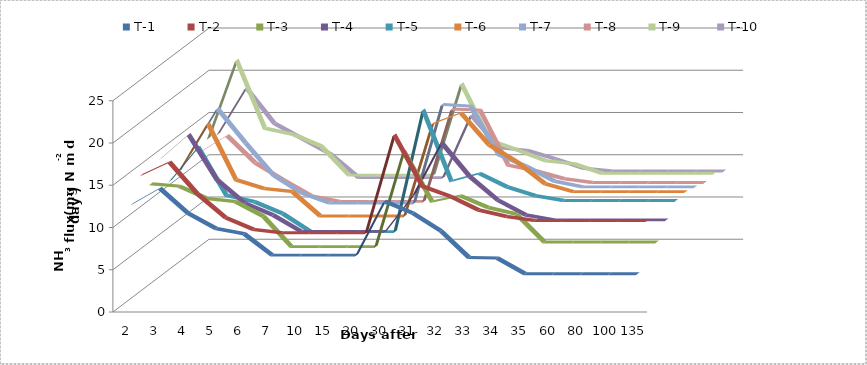
| Category | T-1 | T-2  | T-3 | T-4 | T-5  | T-6 | T-7 | T-8 | T-9  | T-10  |
|---|---|---|---|---|---|---|---|---|---|---|
| 2.0 | 12.25 | 14.84 | 12.95 | 15.05 | 11.55 | 11.9 | 12.915 | 12.32 | 13.16 | 12.81 |
| 3.0 | 14.14 | 16.38 | 12.67 | 17.92 | 15.54 | 17.5 | 18.41 | 14.35 | 22.4 | 18.27 |
| 4.0 | 11.2 | 12.6 | 11.2 | 12.6 | 9.87 | 10.85 | 14.35 | 11.13 | 14.35 | 14.07 |
| 5.0 | 9.38 | 9.8 | 10.85 | 9.8 | 9.1 | 9.8 | 10.5 | 9.1 | 13.65 | 12.25 |
| 6.0 | 8.75 | 8.4 | 9.1 | 8.4 | 7.7 | 9.45 | 8.4 | 7.21 | 12.25 | 10.43 |
| 7.0 | 6.23 | 8.01 | 5.51 | 6.458 | 5.56 | 6.56 | 7.22 | 6.56 | 8.81 | 7.65 |
| 10.0 | 6.23 | 8.01 | 5.51 | 6.458 | 5.56 | 6.56 | 7.22 | 6.56 | 8.81 | 7.65 |
| 15.0 | 6.23 | 8.01 | 5.51 | 6.458 | 5.56 | 6.56 | 7.22 | 6.56 | 8.81 | 7.65 |
| 20.0 | 6.23 | 8.01 | 5.51 | 6.458 | 5.56 | 6.56 | 7.22 | 6.56 | 8.81 | 7.65 |
| 30.0 | 12.6 | 19.6 | 16.8 | 10.71 | 19.95 | 17.5 | 18.9 | 17.5 | 19.6 | 15.05 |
| 31.0 | 11.2 | 13.51 | 10.85 | 16.94 | 11.55 | 18.76 | 18.69 | 17.36 | 12.95 | 11.2 |
| 32.0 | 9.1 | 12.32 | 11.55 | 12.95 | 12.46 | 14.98 | 12.95 | 10.85 | 11.76 | 10.85 |
| 33.0 | 5.95 | 10.71 | 10.15 | 10.15 | 10.85 | 12.95 | 11.55 | 10.15 | 10.5 | 9.87 |
| 34.0 | 5.88 | 9.94 | 9.38 | 8.4 | 9.8 | 10.36 | 9.8 | 9.24 | 10.15 | 8.75 |
| 35.0 | 4.03 | 9.46 | 6.05 | 7.81 | 9.24 | 9.44 | 9.14 | 8.8 | 9.024 | 8.44 |
| 60.0 | 4.03 | 9.46 | 6.05 | 7.81 | 9.24 | 9.44 | 9.14 | 8.8 | 9.024 | 8.44 |
| 80.0 | 4.03 | 9.46 | 6.05 | 7.81 | 9.24 | 9.44 | 9.14 | 8.8 | 9.024 | 8.44 |
| 100.0 | 4.03 | 9.46 | 6.05 | 7.81 | 9.24 | 9.44 | 9.14 | 8.8 | 9.024 | 8.44 |
| 135.0 | 4.03 | 9.46 | 6.05 | 7.81 | 9.24 | 9.44 | 9.14 | 8.8 | 9.024 | 8.44 |